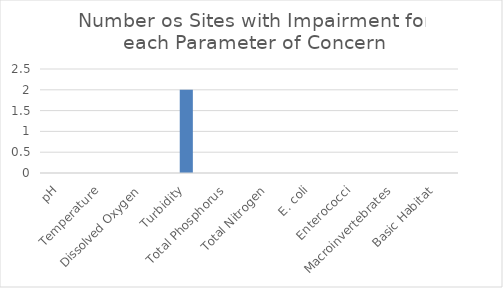
| Category | Series 0 |
|---|---|
| pH | 0 |
| Temperature | 0 |
| Dissolved Oxygen | 0 |
| Turbidity | 2 |
| Total Phosphorus | 0 |
| Total Nitrogen | 0 |
| E. coli | 0 |
| Enterococci | 0 |
| Macroinvertebrates | 0 |
| Basic Habitat | 0 |